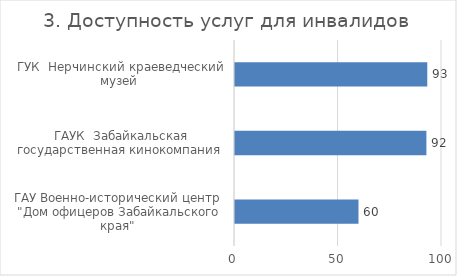
| Category | 3. Доступность услуг для инвалидов |
|---|---|
| ГАУ Военно-исторический центр  "Дом офицеров Забайкальского края"  | 59.654 |
| ГАУК  Забайкальская государственная кинокомпания  | 92.462 |
| ГУК  Нерчинский краеведческий музей  | 92.889 |